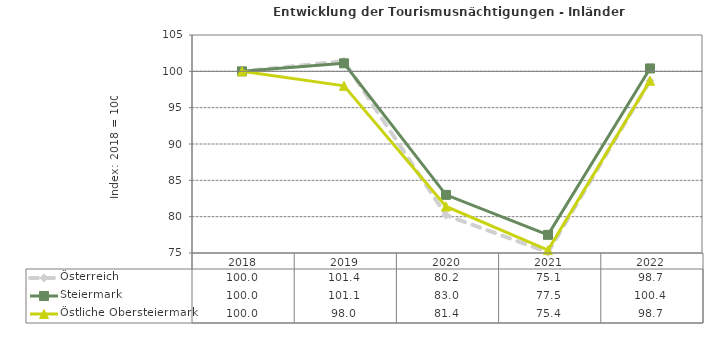
| Category | Österreich | Steiermark | Östliche Obersteiermark |
|---|---|---|---|
| 2022.0 | 98.7 | 100.4 | 98.7 |
| 2021.0 | 75.1 | 77.5 | 75.4 |
| 2020.0 | 80.2 | 83 | 81.4 |
| 2019.0 | 101.4 | 101.1 | 98 |
| 2018.0 | 100 | 100 | 100 |